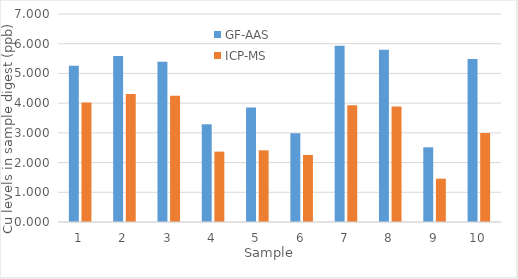
| Category | GF-AAS | ICP-MS |
|---|---|---|
| 0 | 5.257 | 4.019 |
| 1 | 5.588 | 4.307 |
| 2 | 5.396 | 4.249 |
| 3 | 3.288 | 2.368 |
| 4 | 3.856 | 2.412 |
| 5 | 2.99 | 2.257 |
| 6 | 5.928 | 3.93 |
| 7 | 5.796 | 3.884 |
| 8 | 2.514 | 1.457 |
| 9 | 5.485 | 2.997 |